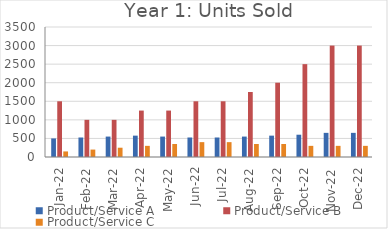
| Category | Product/Service A | Product/Service B | Product/Service C |
|---|---|---|---|
| 2022-01-16 | 500 | 1500 | 150 |
| 2022-02-16 | 525 | 1000 | 200 |
| 2022-03-16 | 550 | 1000 | 250 |
| 2022-04-16 | 575 | 1250 | 300 |
| 2022-05-16 | 550 | 1250 | 350 |
| 2022-06-16 | 525 | 1500 | 400 |
| 2022-07-16 | 525 | 1500 | 400 |
| 2022-08-16 | 550 | 1750 | 350 |
| 2022-09-16 | 575 | 2000 | 350 |
| 2022-10-16 | 600 | 2500 | 300 |
| 2022-11-16 | 650 | 3000 | 300 |
| 2022-12-16 | 650 | 3000 | 300 |